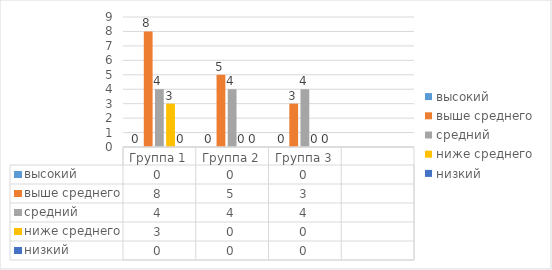
| Category | высокий | выше среднего | средний | ниже среднего | низкий |
|---|---|---|---|---|---|
| Группа 1 | 0 | 8 | 4 | 3 | 0 |
| Группа 2 | 0 | 5 | 4 | 0 | 0 |
| Группа 3 | 0 | 3 | 4 | 0 | 0 |